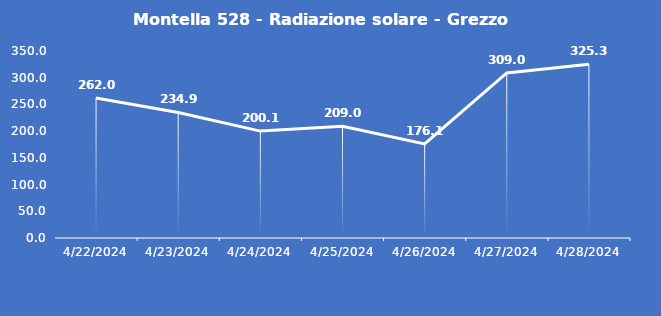
| Category | Montella 528 - Radiazione solare - Grezzo (W/m2) |
|---|---|
| 4/22/24 | 262 |
| 4/23/24 | 234.9 |
| 4/24/24 | 200.1 |
| 4/25/24 | 209 |
| 4/26/24 | 176.1 |
| 4/27/24 | 309 |
| 4/28/24 | 325.3 |